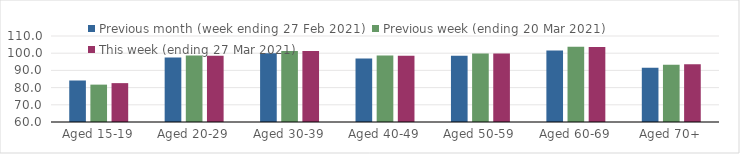
| Category | Previous month (week ending 27 Feb 2021) | Previous week (ending 20 Mar 2021) | This week (ending 27 Mar 2021) |
|---|---|---|---|
| Aged 15-19 | 84.13 | 81.73 | 82.6 |
| Aged 20-29 | 97.57 | 98.66 | 98.5 |
| Aged 30-39 | 99.97 | 101.28 | 101.23 |
| Aged 40-49 | 96.98 | 98.66 | 98.58 |
| Aged 50-59 | 98.51 | 99.85 | 99.81 |
| Aged 60-69 | 101.53 | 103.68 | 103.64 |
| Aged 70+ | 91.48 | 93.22 | 93.51 |